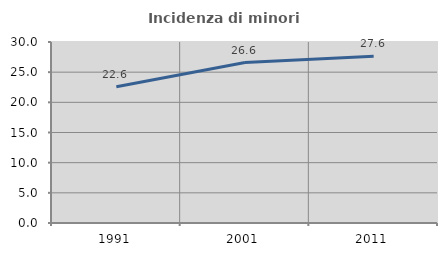
| Category | Incidenza di minori stranieri |
|---|---|
| 1991.0 | 22.581 |
| 2001.0 | 26.596 |
| 2011.0 | 27.626 |